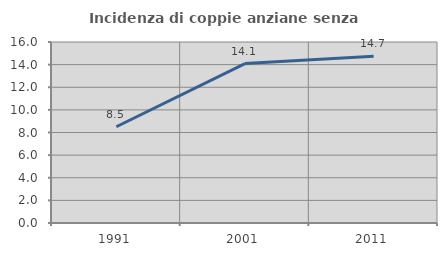
| Category | Incidenza di coppie anziane senza figli  |
|---|---|
| 1991.0 | 8.511 |
| 2001.0 | 14.097 |
| 2011.0 | 14.747 |